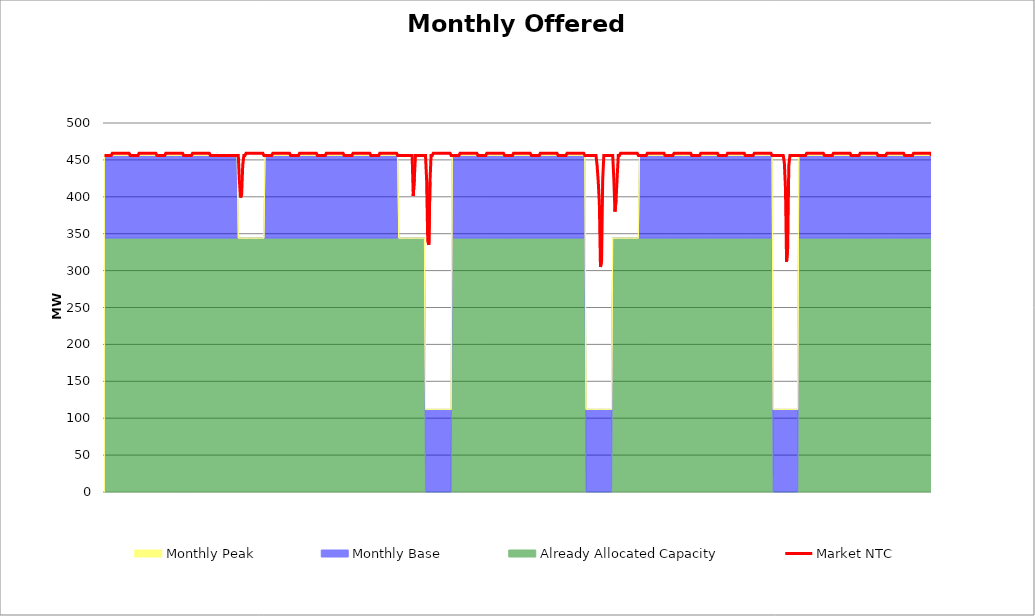
| Category | Market NTC |
|---|---|
| 0 | 456 |
| 1 | 456 |
| 2 | 456 |
| 3 | 456 |
| 4 | 456 |
| 5 | 456 |
| 6 | 456 |
| 7 | 459 |
| 8 | 459 |
| 9 | 459 |
| 10 | 459 |
| 11 | 459 |
| 12 | 459 |
| 13 | 459 |
| 14 | 459 |
| 15 | 459 |
| 16 | 459 |
| 17 | 459 |
| 18 | 459 |
| 19 | 459 |
| 20 | 459 |
| 21 | 459 |
| 22 | 459 |
| 23 | 456 |
| 24 | 456 |
| 25 | 456 |
| 26 | 456 |
| 27 | 456 |
| 28 | 456 |
| 29 | 456 |
| 30 | 456 |
| 31 | 459 |
| 32 | 459 |
| 33 | 459 |
| 34 | 459 |
| 35 | 459 |
| 36 | 459 |
| 37 | 459 |
| 38 | 459 |
| 39 | 459 |
| 40 | 459 |
| 41 | 459 |
| 42 | 459 |
| 43 | 459 |
| 44 | 459 |
| 45 | 459 |
| 46 | 459 |
| 47 | 456 |
| 48 | 456 |
| 49 | 456 |
| 50 | 456 |
| 51 | 456 |
| 52 | 456 |
| 53 | 456 |
| 54 | 456 |
| 55 | 459 |
| 56 | 459 |
| 57 | 459 |
| 58 | 459 |
| 59 | 459 |
| 60 | 459 |
| 61 | 459 |
| 62 | 459 |
| 63 | 459 |
| 64 | 459 |
| 65 | 459 |
| 66 | 459 |
| 67 | 459 |
| 68 | 459 |
| 69 | 459 |
| 70 | 459 |
| 71 | 456 |
| 72 | 456 |
| 73 | 456 |
| 74 | 456 |
| 75 | 456 |
| 76 | 456 |
| 77 | 456 |
| 78 | 456 |
| 79 | 459 |
| 80 | 459 |
| 81 | 459 |
| 82 | 459 |
| 83 | 459 |
| 84 | 459 |
| 85 | 459 |
| 86 | 459 |
| 87 | 459 |
| 88 | 459 |
| 89 | 459 |
| 90 | 459 |
| 91 | 459 |
| 92 | 459 |
| 93 | 459 |
| 94 | 459 |
| 95 | 456 |
| 96 | 456 |
| 97 | 456 |
| 98 | 456 |
| 99 | 456 |
| 100 | 456 |
| 101 | 456 |
| 102 | 456 |
| 103 | 456 |
| 104 | 456 |
| 105 | 456 |
| 106 | 456 |
| 107 | 456 |
| 108 | 456 |
| 109 | 456 |
| 110 | 456 |
| 111 | 456 |
| 112 | 456 |
| 113 | 456 |
| 114 | 456 |
| 115 | 456 |
| 116 | 456 |
| 117 | 456 |
| 118 | 456 |
| 119 | 456 |
| 120 | 456 |
| 121 | 422 |
| 122 | 399 |
| 123 | 403 |
| 124 | 443 |
| 125 | 456 |
| 126 | 456 |
| 127 | 459 |
| 128 | 459 |
| 129 | 459 |
| 130 | 459 |
| 131 | 459 |
| 132 | 459 |
| 133 | 459 |
| 134 | 459 |
| 135 | 459 |
| 136 | 459 |
| 137 | 459 |
| 138 | 459 |
| 139 | 459 |
| 140 | 459 |
| 141 | 459 |
| 142 | 459 |
| 143 | 456 |
| 144 | 456 |
| 145 | 456 |
| 146 | 456 |
| 147 | 456 |
| 148 | 456 |
| 149 | 456 |
| 150 | 456 |
| 151 | 459 |
| 152 | 459 |
| 153 | 459 |
| 154 | 459 |
| 155 | 459 |
| 156 | 459 |
| 157 | 459 |
| 158 | 459 |
| 159 | 459 |
| 160 | 459 |
| 161 | 459 |
| 162 | 459 |
| 163 | 459 |
| 164 | 459 |
| 165 | 459 |
| 166 | 459 |
| 167 | 456 |
| 168 | 456 |
| 169 | 456 |
| 170 | 456 |
| 171 | 456 |
| 172 | 456 |
| 173 | 456 |
| 174 | 456 |
| 175 | 459 |
| 176 | 459 |
| 177 | 459 |
| 178 | 459 |
| 179 | 459 |
| 180 | 459 |
| 181 | 459 |
| 182 | 459 |
| 183 | 459 |
| 184 | 459 |
| 185 | 459 |
| 186 | 459 |
| 187 | 459 |
| 188 | 459 |
| 189 | 459 |
| 190 | 459 |
| 191 | 456 |
| 192 | 456 |
| 193 | 456 |
| 194 | 456 |
| 195 | 456 |
| 196 | 456 |
| 197 | 456 |
| 198 | 456 |
| 199 | 459 |
| 200 | 459 |
| 201 | 459 |
| 202 | 459 |
| 203 | 459 |
| 204 | 459 |
| 205 | 459 |
| 206 | 459 |
| 207 | 459 |
| 208 | 459 |
| 209 | 459 |
| 210 | 459 |
| 211 | 459 |
| 212 | 459 |
| 213 | 459 |
| 214 | 459 |
| 215 | 456 |
| 216 | 456 |
| 217 | 456 |
| 218 | 456 |
| 219 | 456 |
| 220 | 456 |
| 221 | 456 |
| 222 | 456 |
| 223 | 459 |
| 224 | 459 |
| 225 | 459 |
| 226 | 459 |
| 227 | 459 |
| 228 | 459 |
| 229 | 459 |
| 230 | 459 |
| 231 | 459 |
| 232 | 459 |
| 233 | 459 |
| 234 | 459 |
| 235 | 459 |
| 236 | 459 |
| 237 | 459 |
| 238 | 459 |
| 239 | 456 |
| 240 | 456 |
| 241 | 456 |
| 242 | 456 |
| 243 | 456 |
| 244 | 456 |
| 245 | 456 |
| 246 | 456 |
| 247 | 459 |
| 248 | 459 |
| 249 | 459 |
| 250 | 459 |
| 251 | 459 |
| 252 | 459 |
| 253 | 459 |
| 254 | 459 |
| 255 | 459 |
| 256 | 459 |
| 257 | 459 |
| 258 | 459 |
| 259 | 459 |
| 260 | 459 |
| 261 | 459 |
| 262 | 459 |
| 263 | 456 |
| 264 | 456 |
| 265 | 456 |
| 266 | 456 |
| 267 | 456 |
| 268 | 456 |
| 269 | 456 |
| 270 | 456 |
| 271 | 456 |
| 272 | 456 |
| 273 | 456 |
| 274 | 456 |
| 275 | 456 |
| 276 | 456 |
| 277 | 401 |
| 278 | 426 |
| 279 | 456 |
| 280 | 456 |
| 281 | 456 |
| 282 | 456 |
| 283 | 456 |
| 284 | 456 |
| 285 | 456 |
| 286 | 456 |
| 287 | 456 |
| 288 | 456 |
| 289 | 423 |
| 290 | 340 |
| 291 | 335 |
| 292 | 420 |
| 293 | 456 |
| 294 | 456 |
| 295 | 459 |
| 296 | 459 |
| 297 | 459 |
| 298 | 459 |
| 299 | 459 |
| 300 | 459 |
| 301 | 459 |
| 302 | 459 |
| 303 | 459 |
| 304 | 459 |
| 305 | 459 |
| 306 | 459 |
| 307 | 459 |
| 308 | 459 |
| 309 | 459 |
| 310 | 459 |
| 311 | 456 |
| 312 | 456 |
| 313 | 456 |
| 314 | 456 |
| 315 | 456 |
| 316 | 456 |
| 317 | 456 |
| 318 | 456 |
| 319 | 459 |
| 320 | 459 |
| 321 | 459 |
| 322 | 459 |
| 323 | 459 |
| 324 | 459 |
| 325 | 459 |
| 326 | 459 |
| 327 | 459 |
| 328 | 459 |
| 329 | 459 |
| 330 | 459 |
| 331 | 459 |
| 332 | 459 |
| 333 | 459 |
| 334 | 459 |
| 335 | 456 |
| 336 | 456 |
| 337 | 456 |
| 338 | 456 |
| 339 | 456 |
| 340 | 456 |
| 341 | 456 |
| 342 | 456 |
| 343 | 459 |
| 344 | 459 |
| 345 | 459 |
| 346 | 459 |
| 347 | 459 |
| 348 | 459 |
| 349 | 459 |
| 350 | 459 |
| 351 | 459 |
| 352 | 459 |
| 353 | 459 |
| 354 | 459 |
| 355 | 459 |
| 356 | 459 |
| 357 | 459 |
| 358 | 459 |
| 359 | 456 |
| 360 | 456 |
| 361 | 456 |
| 362 | 456 |
| 363 | 456 |
| 364 | 456 |
| 365 | 456 |
| 366 | 456 |
| 367 | 459 |
| 368 | 459 |
| 369 | 459 |
| 370 | 459 |
| 371 | 459 |
| 372 | 459 |
| 373 | 459 |
| 374 | 459 |
| 375 | 459 |
| 376 | 459 |
| 377 | 459 |
| 378 | 459 |
| 379 | 459 |
| 380 | 459 |
| 381 | 459 |
| 382 | 459 |
| 383 | 456 |
| 384 | 456 |
| 385 | 456 |
| 386 | 456 |
| 387 | 456 |
| 388 | 456 |
| 389 | 456 |
| 390 | 456 |
| 391 | 459 |
| 392 | 459 |
| 393 | 459 |
| 394 | 459 |
| 395 | 459 |
| 396 | 459 |
| 397 | 459 |
| 398 | 459 |
| 399 | 459 |
| 400 | 459 |
| 401 | 459 |
| 402 | 459 |
| 403 | 459 |
| 404 | 459 |
| 405 | 459 |
| 406 | 459 |
| 407 | 456 |
| 408 | 456 |
| 409 | 456 |
| 410 | 456 |
| 411 | 456 |
| 412 | 456 |
| 413 | 456 |
| 414 | 456 |
| 415 | 459 |
| 416 | 459 |
| 417 | 459 |
| 418 | 459 |
| 419 | 459 |
| 420 | 459 |
| 421 | 459 |
| 422 | 459 |
| 423 | 459 |
| 424 | 459 |
| 425 | 459 |
| 426 | 459 |
| 427 | 459 |
| 428 | 459 |
| 429 | 459 |
| 430 | 459 |
| 431 | 456 |
| 432 | 456 |
| 433 | 456 |
| 434 | 456 |
| 435 | 456 |
| 436 | 456 |
| 437 | 456 |
| 438 | 456 |
| 439 | 456 |
| 440 | 456 |
| 441 | 456 |
| 442 | 442 |
| 443 | 421 |
| 444 | 391 |
| 445 | 305 |
| 446 | 313 |
| 447 | 423 |
| 448 | 456 |
| 449 | 456 |
| 450 | 456 |
| 451 | 456 |
| 452 | 456 |
| 453 | 456 |
| 454 | 456 |
| 455 | 456 |
| 456 | 456 |
| 457 | 424 |
| 458 | 380 |
| 459 | 396 |
| 460 | 427 |
| 461 | 456 |
| 462 | 456 |
| 463 | 459 |
| 464 | 459 |
| 465 | 459 |
| 466 | 459 |
| 467 | 459 |
| 468 | 459 |
| 469 | 459 |
| 470 | 459 |
| 471 | 459 |
| 472 | 459 |
| 473 | 459 |
| 474 | 459 |
| 475 | 459 |
| 476 | 459 |
| 477 | 459 |
| 478 | 459 |
| 479 | 456 |
| 480 | 456 |
| 481 | 456 |
| 482 | 456 |
| 483 | 456 |
| 484 | 456 |
| 485 | 456 |
| 486 | 456 |
| 487 | 459 |
| 488 | 459 |
| 489 | 459 |
| 490 | 459 |
| 491 | 459 |
| 492 | 459 |
| 493 | 459 |
| 494 | 459 |
| 495 | 459 |
| 496 | 459 |
| 497 | 459 |
| 498 | 459 |
| 499 | 459 |
| 500 | 459 |
| 501 | 459 |
| 502 | 459 |
| 503 | 456 |
| 504 | 456 |
| 505 | 456 |
| 506 | 456 |
| 507 | 456 |
| 508 | 456 |
| 509 | 456 |
| 510 | 456 |
| 511 | 459 |
| 512 | 459 |
| 513 | 459 |
| 514 | 459 |
| 515 | 459 |
| 516 | 459 |
| 517 | 459 |
| 518 | 459 |
| 519 | 459 |
| 520 | 459 |
| 521 | 459 |
| 522 | 459 |
| 523 | 459 |
| 524 | 459 |
| 525 | 459 |
| 526 | 459 |
| 527 | 456 |
| 528 | 456 |
| 529 | 456 |
| 530 | 456 |
| 531 | 456 |
| 532 | 456 |
| 533 | 456 |
| 534 | 456 |
| 535 | 459 |
| 536 | 459 |
| 537 | 459 |
| 538 | 459 |
| 539 | 459 |
| 540 | 459 |
| 541 | 459 |
| 542 | 459 |
| 543 | 459 |
| 544 | 459 |
| 545 | 459 |
| 546 | 459 |
| 547 | 459 |
| 548 | 459 |
| 549 | 459 |
| 550 | 459 |
| 551 | 456 |
| 552 | 456 |
| 553 | 456 |
| 554 | 456 |
| 555 | 456 |
| 556 | 456 |
| 557 | 456 |
| 558 | 456 |
| 559 | 459 |
| 560 | 459 |
| 561 | 459 |
| 562 | 459 |
| 563 | 459 |
| 564 | 459 |
| 565 | 459 |
| 566 | 459 |
| 567 | 459 |
| 568 | 459 |
| 569 | 459 |
| 570 | 459 |
| 571 | 459 |
| 572 | 459 |
| 573 | 459 |
| 574 | 459 |
| 575 | 456 |
| 576 | 456 |
| 577 | 456 |
| 578 | 456 |
| 579 | 456 |
| 580 | 456 |
| 581 | 456 |
| 582 | 456 |
| 583 | 459 |
| 584 | 459 |
| 585 | 459 |
| 586 | 459 |
| 587 | 459 |
| 588 | 459 |
| 589 | 459 |
| 590 | 459 |
| 591 | 459 |
| 592 | 459 |
| 593 | 459 |
| 594 | 459 |
| 595 | 459 |
| 596 | 459 |
| 597 | 459 |
| 598 | 459 |
| 599 | 456 |
| 600 | 456 |
| 601 | 456 |
| 602 | 456 |
| 603 | 456 |
| 604 | 456 |
| 605 | 456 |
| 606 | 456 |
| 607 | 456 |
| 608 | 456 |
| 609 | 456 |
| 610 | 446 |
| 611 | 412 |
| 612 | 312 |
| 613 | 331 |
| 614 | 442 |
| 615 | 456 |
| 616 | 456 |
| 617 | 456 |
| 618 | 456 |
| 619 | 456 |
| 620 | 456 |
| 621 | 456 |
| 622 | 456 |
| 623 | 456 |
| 624 | 456 |
| 625 | 456 |
| 626 | 456 |
| 627 | 456 |
| 628 | 456 |
| 629 | 456 |
| 630 | 459 |
| 631 | 459 |
| 632 | 459 |
| 633 | 459 |
| 634 | 459 |
| 635 | 459 |
| 636 | 459 |
| 637 | 459 |
| 638 | 459 |
| 639 | 459 |
| 640 | 459 |
| 641 | 459 |
| 642 | 459 |
| 643 | 459 |
| 644 | 459 |
| 645 | 459 |
| 646 | 456 |
| 647 | 456 |
| 648 | 456 |
| 649 | 456 |
| 650 | 456 |
| 651 | 456 |
| 652 | 456 |
| 653 | 456 |
| 654 | 459 |
| 655 | 459 |
| 656 | 459 |
| 657 | 459 |
| 658 | 459 |
| 659 | 459 |
| 660 | 459 |
| 661 | 459 |
| 662 | 459 |
| 663 | 459 |
| 664 | 459 |
| 665 | 459 |
| 666 | 459 |
| 667 | 459 |
| 668 | 459 |
| 669 | 459 |
| 670 | 456 |
| 671 | 456 |
| 672 | 456 |
| 673 | 456 |
| 674 | 456 |
| 675 | 456 |
| 676 | 456 |
| 677 | 456 |
| 678 | 459 |
| 679 | 459 |
| 680 | 459 |
| 681 | 459 |
| 682 | 459 |
| 683 | 459 |
| 684 | 459 |
| 685 | 459 |
| 686 | 459 |
| 687 | 459 |
| 688 | 459 |
| 689 | 459 |
| 690 | 459 |
| 691 | 459 |
| 692 | 459 |
| 693 | 459 |
| 694 | 456 |
| 695 | 456 |
| 696 | 456 |
| 697 | 456 |
| 698 | 456 |
| 699 | 456 |
| 700 | 456 |
| 701 | 456 |
| 702 | 459 |
| 703 | 459 |
| 704 | 459 |
| 705 | 459 |
| 706 | 459 |
| 707 | 459 |
| 708 | 459 |
| 709 | 459 |
| 710 | 459 |
| 711 | 459 |
| 712 | 459 |
| 713 | 459 |
| 714 | 459 |
| 715 | 459 |
| 716 | 459 |
| 717 | 459 |
| 718 | 456 |
| 719 | 456 |
| 720 | 456 |
| 721 | 456 |
| 722 | 456 |
| 723 | 456 |
| 724 | 456 |
| 725 | 456 |
| 726 | 459 |
| 727 | 459 |
| 728 | 459 |
| 729 | 459 |
| 730 | 459 |
| 731 | 459 |
| 732 | 459 |
| 733 | 459 |
| 734 | 459 |
| 735 | 459 |
| 736 | 459 |
| 737 | 459 |
| 738 | 459 |
| 739 | 459 |
| 740 | 459 |
| 741 | 459 |
| 742 | 456 |